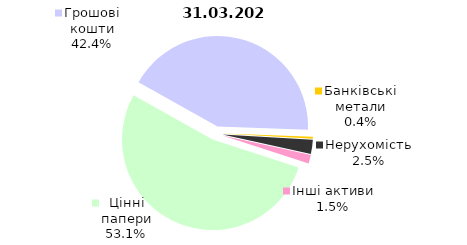
| Category | Series 0 |
|---|---|
| Цінні папери | 2277.484 |
| Грошові кошти | 1818.783 |
| Банківські метали | 16.052 |
| Нерухомість | 108.949 |
| Інші активи | 65.442 |